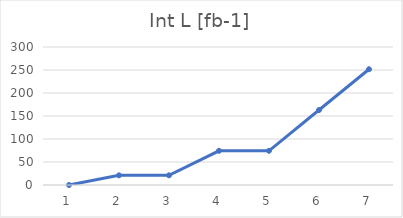
| Category | Int L [fb-1] |
|---|---|
| 0 | 0 |
| 1 | 21.052 |
| 2 | 21.052 |
| 3 | 74.339 |
| 4 | 74.339 |
| 5 | 162.987 |
| 6 | 251.635 |